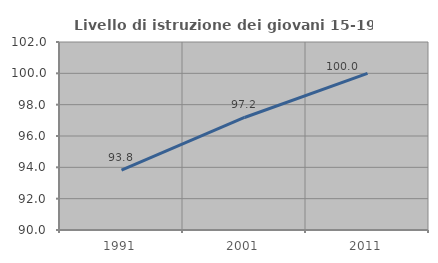
| Category | Livello di istruzione dei giovani 15-19 anni |
|---|---|
| 1991.0 | 93.827 |
| 2001.0 | 97.183 |
| 2011.0 | 100 |